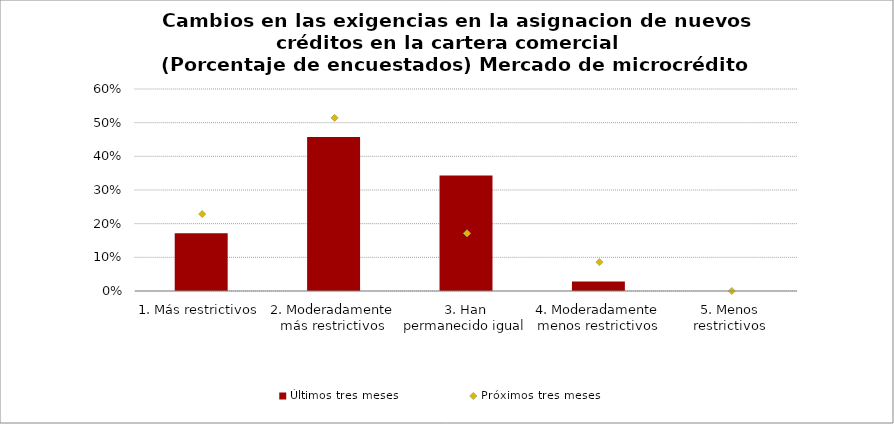
| Category | Últimos tres meses |
|---|---|
| 1. Más restrictivos | 0.171 |
| 2. Moderadamente más restrictivos | 0.457 |
| 3. Han permanecido igual | 0.343 |
| 4. Moderadamente menos restrictivos | 0.029 |
| 5. Menos restrictivos | 0 |